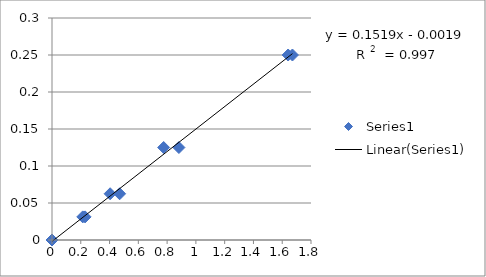
| Category | Series 0 |
|---|---|
| 0.0 | 0 |
| 0.23 | 0.031 |
| 0.404 | 0.062 |
| 0.882 | 0.125 |
| 1.641 | 0.25 |
| 0.214 | 0.031 |
| 0.47 | 0.062 |
| 0.776 | 0.125 |
| 1.671 | 0.25 |